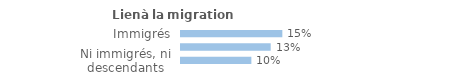
| Category | Series 0 |
|---|---|
| Immigrés | 0.15 |
| Descendants d'immigré(s) | 0.133 |
| Ni immigrés, ni descendants | 0.104 |